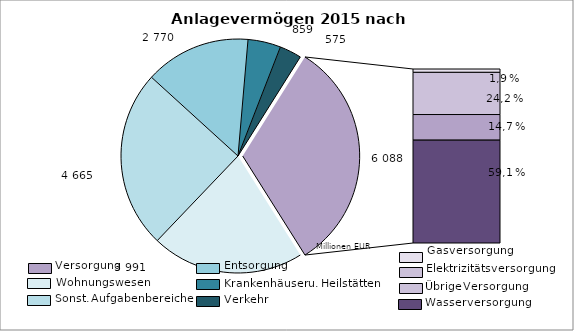
| Category | Series 0 |
|---|---|
| Wohnungsunternehmen | 3991 |
| sonstige Aufgabenbereiche | 4665 |
| Entsorgungsunternehmen | 2770 |
| Krankenhäuser | 859 |
| Verkehrsunternehmen | 575 |
| Gas | 117 |
| Elektrizität | 1476 |
| Kombinierte Unternehmen | 896 |
| Wasser | 3598 |